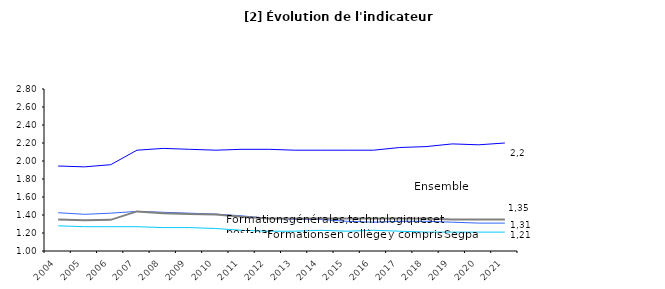
| Category | Formations en collège y compris Segpa | Formations professionnelles en lycée | Formations générales et technologiques et post-bac en lycée | Ensemble |
|---|---|---|---|---|
| 2004.0 | 1.28 | 1.944 | 1.425 | 1.351 |
| 2005.0 | 1.27 | 1.935 | 1.407 | 1.341 |
| 2006.0 | 1.27 | 1.959 | 1.42 | 1.346 |
| 2007.0 | 1.27 | 2.12 | 1.44 | 1.44 |
| 2008.0 | 1.26 | 2.14 | 1.43 | 1.42 |
| 2009.0 | 1.26 | 2.13 | 1.42 | 1.41 |
| 2010.0 | 1.25 | 2.12 | 1.41 | 1.407 |
| 2011.0 | 1.23 | 2.13 | 1.39 | 1.38 |
| 2012.0 | 1.22 | 2.13 | 1.363 | 1.36 |
| 2013.0 | 1.22 | 2.12 | 1.353 | 1.36 |
| 2014.0 | 1.23 | 2.12 | 1.35 | 1.36 |
| 2015.0 | 1.22 | 2.12 | 1.33 | 1.36 |
| 2016.0 | 1.23 | 2.12 | 1.32 | 1.36 |
| 2017.0 | 1.22 | 2.15 | 1.33 | 1.36 |
| 2018.0 | 1.21 | 2.16 | 1.33 | 1.36 |
| 2019.0 | 1.21 | 2.19 | 1.32 | 1.35 |
| 2020.0 | 1.21 | 2.18 | 1.31 | 1.35 |
| 2021.0 | 1.21 | 2.2 | 1.31 | 1.35 |